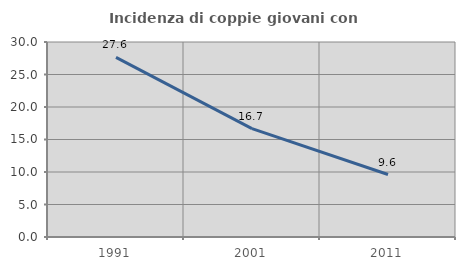
| Category | Incidenza di coppie giovani con figli |
|---|---|
| 1991.0 | 27.63 |
| 2001.0 | 16.676 |
| 2011.0 | 9.614 |